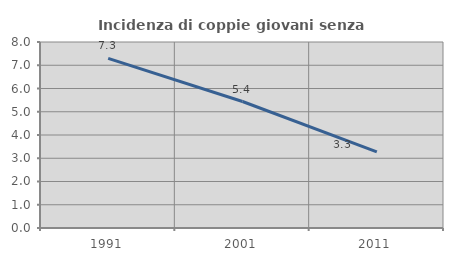
| Category | Incidenza di coppie giovani senza figli |
|---|---|
| 1991.0 | 7.296 |
| 2001.0 | 5.441 |
| 2011.0 | 3.274 |